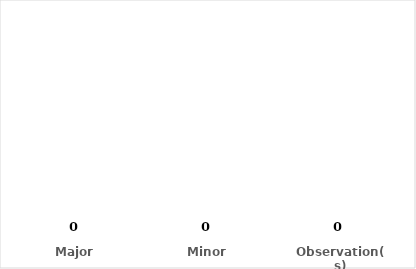
| Category | Series 0 |
|---|---|
| Major | 0 |
| Minor | 0 |
| Observation(s) | 0 |